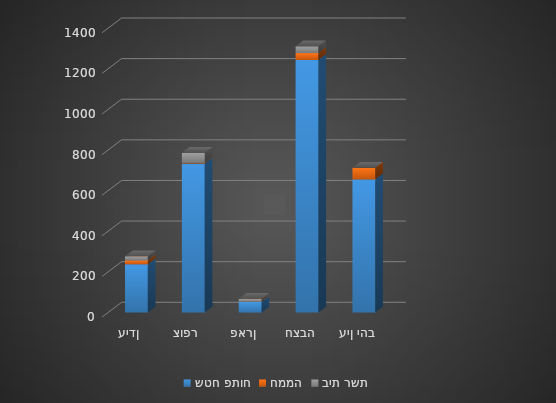
| Category | שטח פתוח | חממה | בית רשת |
|---|---|---|---|
| עין יהב | 656 | 57 | 0 |
| חצבה | 1244 | 34 | 33 |
| פארן | 52 | 1 | 15 |
| צופר | 734 | 3 | 50 |
| עידן | 238 | 19 | 20 |